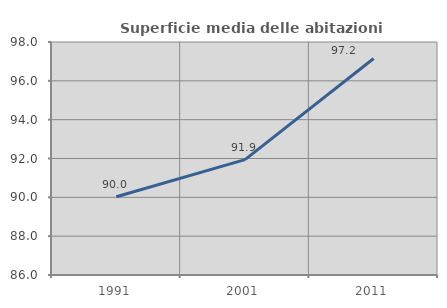
| Category | Superficie media delle abitazioni occupate |
|---|---|
| 1991.0 | 90.031 |
| 2001.0 | 91.939 |
| 2011.0 | 97.152 |